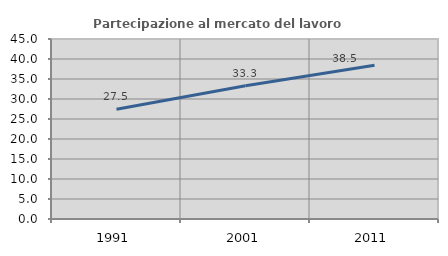
| Category | Partecipazione al mercato del lavoro  femminile |
|---|---|
| 1991.0 | 27.451 |
| 2001.0 | 33.333 |
| 2011.0 | 38.462 |